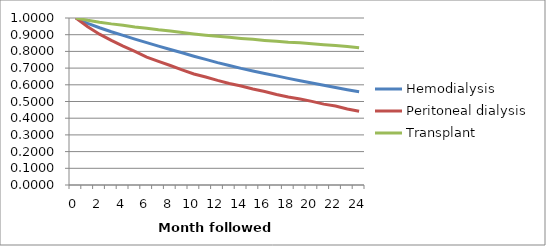
| Category | Hemodialysis | Peritoneal dialysis | Transplant |
|---|---|---|---|
| 0.0 | 1 | 1 | 1 |
| 1.0 | 0.968 | 0.947 | 0.986 |
| 2.0 | 0.941 | 0.903 | 0.975 |
| 3.0 | 0.918 | 0.866 | 0.965 |
| 4.0 | 0.896 | 0.832 | 0.956 |
| 5.0 | 0.873 | 0.799 | 0.946 |
| 6.0 | 0.853 | 0.766 | 0.939 |
| 7.0 | 0.831 | 0.74 | 0.93 |
| 8.0 | 0.811 | 0.716 | 0.923 |
| 9.0 | 0.792 | 0.69 | 0.913 |
| 10.0 | 0.771 | 0.665 | 0.905 |
| 11.0 | 0.752 | 0.647 | 0.897 |
| 12.0 | 0.733 | 0.626 | 0.89 |
| 13.0 | 0.715 | 0.608 | 0.884 |
| 14.0 | 0.698 | 0.593 | 0.878 |
| 15.0 | 0.683 | 0.575 | 0.872 |
| 16.0 | 0.668 | 0.56 | 0.866 |
| 17.0 | 0.653 | 0.542 | 0.861 |
| 18.0 | 0.639 | 0.527 | 0.855 |
| 19.0 | 0.624 | 0.515 | 0.852 |
| 20.0 | 0.611 | 0.501 | 0.846 |
| 21.0 | 0.597 | 0.484 | 0.84 |
| 22.0 | 0.583 | 0.473 | 0.836 |
| 23.0 | 0.571 | 0.455 | 0.83 |
| 24.0 | 0.558 | 0.441 | 0.822 |